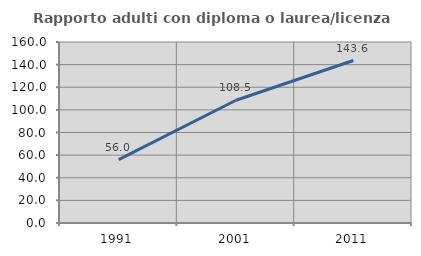
| Category | Rapporto adulti con diploma o laurea/licenza media  |
|---|---|
| 1991.0 | 55.956 |
| 2001.0 | 108.517 |
| 2011.0 | 143.631 |